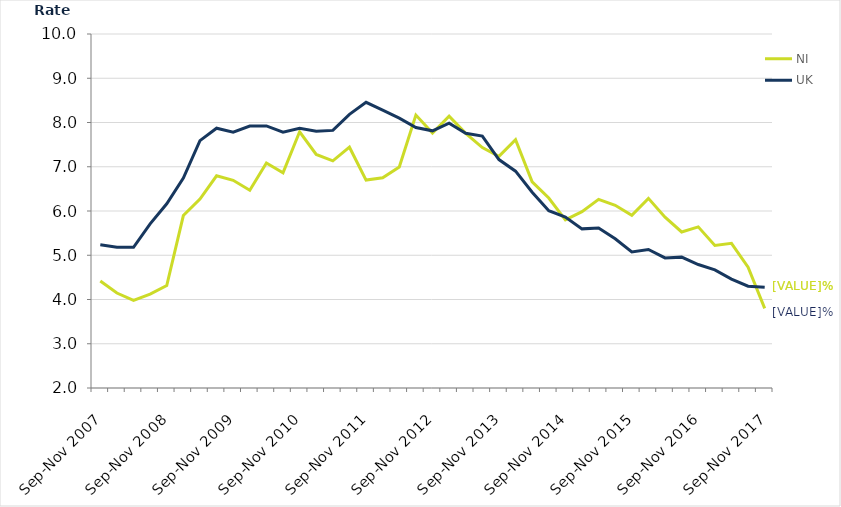
| Category | NI | UK |
|---|---|---|
| Sep-Nov 2007 | 4.419 | 5.239 |
| Dec-Feb 2008 | 4.146 | 5.181 |
| Mar-May 2008 | 3.979 | 5.179 |
| Jun-Aug 2008 | 4.122 | 5.71 |
| Sep-Nov 2008 | 4.317 | 6.163 |
| Dec-Feb 2009 | 5.897 | 6.744 |
| Mar-May 2009 | 6.27 | 7.59 |
| Jun-Aug 2009 | 6.796 | 7.87 |
| Sep-Nov 2009 | 6.693 | 7.781 |
| Dec-Feb 2010 | 6.47 | 7.92 |
| Mar-May 2010 | 7.085 | 7.923 |
| Jun-Aug 2010 | 6.862 | 7.782 |
| Sep-Nov 2010 | 7.791 | 7.871 |
| Dec-Feb 2011 | 7.277 | 7.803 |
| Mar-May 2011 | 7.133 | 7.822 |
| Jun-Aug 2011 | 7.442 | 8.185 |
| Sep-Nov 2011 | 6.699 | 8.455 |
| Dec-Feb 2012 | 6.75 | 8.279 |
| Mar-May 2012 | 6.993 | 8.098 |
| Jun-Aug 2012 | 8.168 | 7.888 |
| Sep-Nov 2012 | 7.762 | 7.812 |
| Dec-Feb 2013 | 8.142 | 7.984 |
| Mar-May 2013 | 7.756 | 7.757 |
| Jun-Aug 2013 | 7.434 | 7.692 |
| Sep-Nov 2013 | 7.236 | 7.162 |
| Dec-Feb 2014 | 7.609 | 6.9 |
| Mar-May 2014 | 6.657 | 6.425 |
| Jun-Aug 2014 | 6.294 | 6.007 |
| Sep-Nov 2014 | 5.801 | 5.864 |
| Dec-Feb 2015 | 5.986 | 5.596 |
| Mar-May 2015 | 6.263 | 5.615 |
| Jun-Aug 2015 | 6.129 | 5.371 |
| Sep-Nov 2015 | 5.902 | 5.074 |
| Dec-Feb 2016 | 6.285 | 5.13 |
| Mar-May 2016 | 5.859 | 4.94 |
| Jun-Aug 2016 | 5.526 | 4.957 |
| Sep-Nov 2016 | 5.642 | 4.79 |
| Dec-Feb 2017 | 5.222 | 4.668 |
| Mar-May 2017 | 5.269 | 4.461 |
| Jun-Aug 2017 | 4.729 | 4.301 |
| Sep-Nov 2017 | 3.8 | 4.278 |